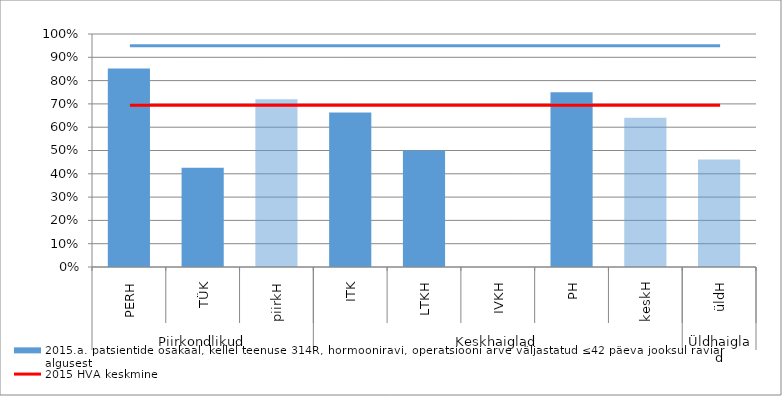
| Category | 2015.a. patsientide osakaal, kellel teenuse 314R, hormooniravi, operatsiooni arve väljastatud ≤42 päeva jooksul raviarve algusest |
|---|---|
| 0 | 0.852 |
| 1 | 0.426 |
| 2 | 0.72 |
| 3 | 0.663 |
| 4 | 0.5 |
| 5 | 0 |
| 6 | 0.75 |
| 7 | 0.64 |
| 8 | 0.462 |